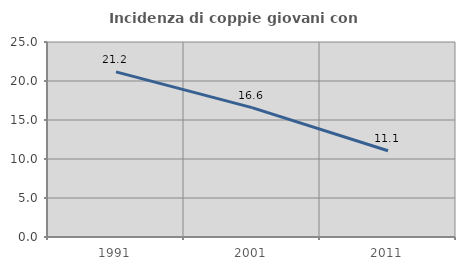
| Category | Incidenza di coppie giovani con figli |
|---|---|
| 1991.0 | 21.175 |
| 2001.0 | 16.584 |
| 2011.0 | 11.058 |